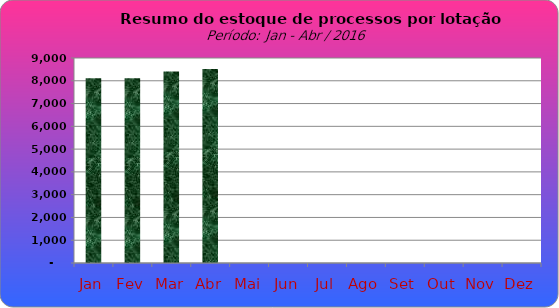
| Category | Series 0 |
|---|---|
| Jan | 8111 |
| Fev | 8114 |
| Mar | 8403 |
| Abr | 8512 |
| Mai | 0 |
| Jun | 0 |
| Jul | 0 |
| Ago | 0 |
| Set | 0 |
| Out | 0 |
| Nov | 0 |
| Dez | 0 |